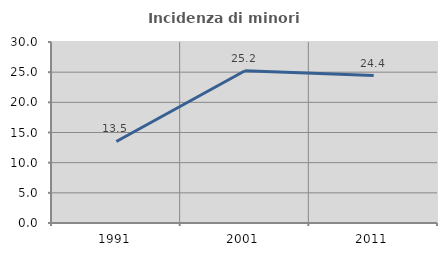
| Category | Incidenza di minori stranieri |
|---|---|
| 1991.0 | 13.514 |
| 2001.0 | 25.234 |
| 2011.0 | 24.441 |